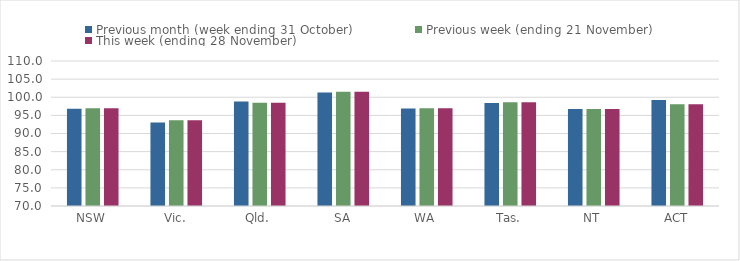
| Category | Previous month (week ending 31 October) | Previous week (ending 21 November) | This week (ending 28 November) |
|---|---|---|---|
| NSW | 96.81 | 96.96 | 96.96 |
| Vic. | 93.04 | 93.65 | 93.65 |
| Qld. | 98.84 | 98.5 | 98.5 |
| SA | 101.29 | 101.55 | 101.55 |
| WA | 96.87 | 96.95 | 96.95 |
| Tas. | 98.42 | 98.59 | 98.59 |
| NT | 96.77 | 96.77 | 96.77 |
| ACT | 99.26 | 98.07 | 98.07 |